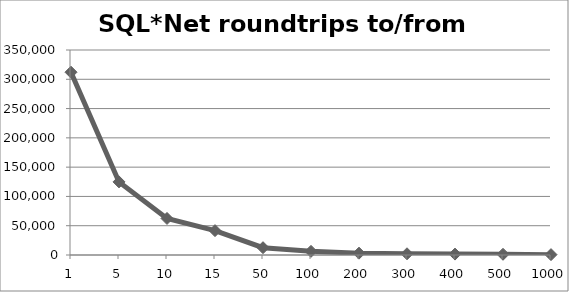
| Category | SQL*Net roundtrips to/from client |
|---|---|
| 1.0 | 312043 |
| 5.0 | 124818 |
| 10.0 | 62410 |
| 15.0 | 41607 |
| 50.0 | 12483 |
| 100.0 | 6242 |
| 200.0 | 3122 |
| 300.0 | 2082 |
| 400.0 | 1562 |
| 500.0 | 1250 |
| 1000.0 | 626 |